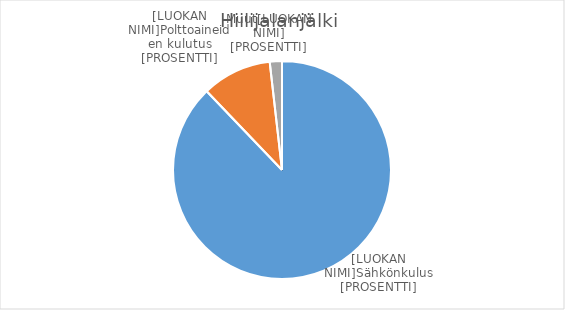
| Category | Series 0 |
|---|---|
| 0 | 8218 |
| 1 | 966.866 |
| 2 | 169.073 |